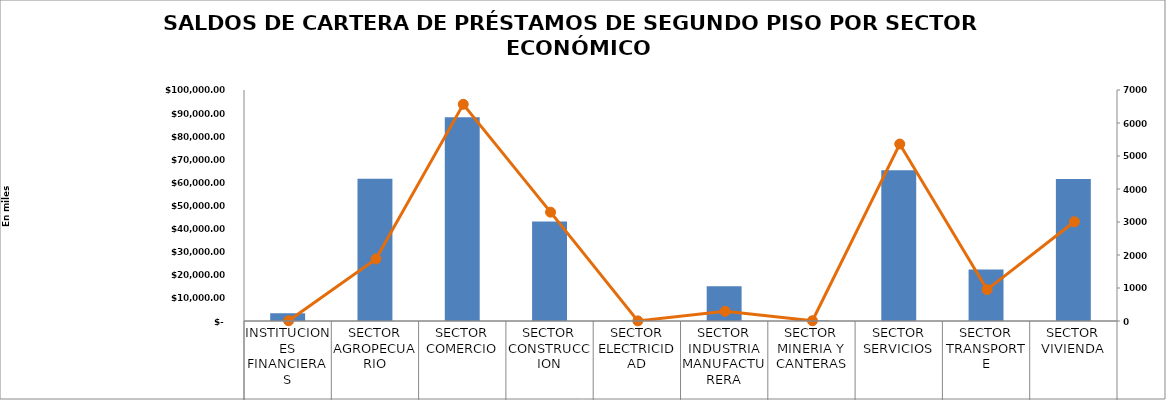
| Category |  Saldo del Crédito en Miles US$ |
|---|---|
| INSTITUCIONES FINANCIERAS | 3315.558 |
| SECTOR AGROPECUARIO | 61582.755 |
| SECTOR COMERCIO | 88158.955 |
| SECTOR CONSTRUCCION | 43037.221 |
| SECTOR ELECTRICIDAD | 102.434 |
| SECTOR INDUSTRIA MANUFACTURERA | 15090.786 |
| SECTOR MINERIA Y CANTERAS | 189.286 |
| SECTOR SERVICIOS | 65289.244 |
| SECTOR TRANSPORTE | 22324.744 |
| SECTOR VIVIENDA | 61418.576 |